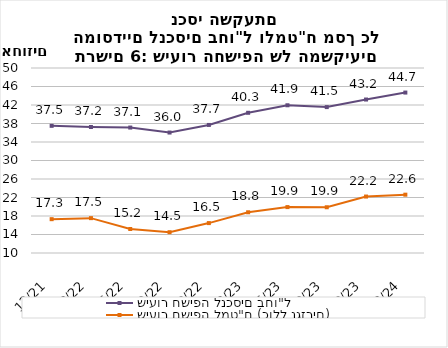
| Category | שיעור חשיפה לנכסים בחו"ל | שיעור חשיפה למט"ח (כולל נגזרים) |
|---|---|---|
| 2021-12-31 | 37.497 | 17.314 |
| 2022-03-31 | 37.241 | 17.538 |
| 2022-06-30 | 37.122 | 15.186 |
| 2022-09-30 | 36.045 | 14.495 |
| 2022-12-31 | 37.687 | 16.465 |
| 2023-03-31 | 40.315 | 18.806 |
| 2023-06-30 | 41.942 | 19.926 |
| 2023-09-30 | 41.546 | 19.891 |
| 2023-12-31 | 43.183 | 22.207 |
| 2024-03-31 | 44.688 | 22.611 |